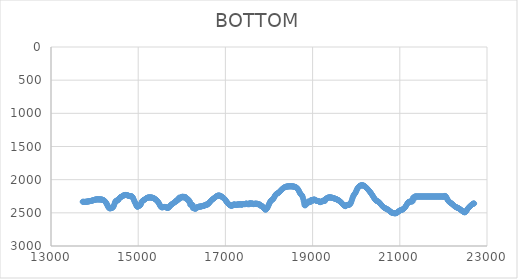
| Category | BOTTOM |
|---|---|
| 13726.741 | 2332.74 |
| 13736.9811 | 2333.78 |
| 13747.2211 | 2334.45 |
| 13757.4612 | 2334.8 |
| 13767.7013 | 2334.85 |
| 13777.9413 | 2334.63 |
| 13788.1814 | 2334.19 |
| 13798.4215 | 2333.54 |
| 13808.6615 | 2332.74 |
| 13818.9016 | 2331.8 |
| 13829.1416 | 2330.76 |
| 13839.3817 | 2329.65 |
| 13849.6218 | 2328.51 |
| 13859.8618 | 2327.37 |
| 13870.1019 | 2326.2 |
| 13880.342 | 2324.99 |
| 13890.582 | 2323.73 |
| 13900.8221 | 2322.39 |
| 13911.0622 | 2320.95 |
| 13921.3022 | 2319.39 |
| 13931.5423 | 2317.7 |
| 13941.7824 | 2315.85 |
| 13952.0224 | 2313.83 |
| 13962.2625 | 2311.7 |
| 13972.5026 | 2309.52 |
| 13982.7426 | 2307.33 |
| 13992.9827 | 2305.21 |
| 14003.2227 | 2303.2 |
| 14013.4628 | 2301.37 |
| 14023.7029 | 2299.78 |
| 14033.9429 | 2298.49 |
| 14044.183 | 2297.55 |
| 14054.4231 | 2297 |
| 14064.6631 | 2296.78 |
| 14074.9032 | 2296.81 |
| 14085.1433 | 2297 |
| 14095.3833 | 2297.27 |
| 14105.6234 | 2297.55 |
| 14115.8635 | 2297.76 |
| 14126.1035 | 2297.98 |
| 14136.3436 | 2298.3 |
| 14146.5837 | 2298.81 |
| 14156.8237 | 2299.6 |
| 14167.0638 | 2300.77 |
| 14177.3039 | 2302.39 |
| 14187.5439 | 2304.57 |
| 14197.784 | 2307.4 |
| 14208.024 | 2310.97 |
| 14218.2641 | 2315.4 |
| 14228.5042 | 2320.79 |
| 14238.7442 | 2327.28 |
| 14248.9843 | 2334.98 |
| 14259.2244 | 2344 |
| 14269.4644 | 2354.46 |
| 14279.7045 | 2366.52 |
| 14289.9446 | 2380.08 |
| 14300.1846 | 2394.14 |
| 14310.4247 | 2407.48 |
| 14320.6648 | 2418.86 |
| 14330.9048 | 2427.05 |
| 14341.1449 | 2431.23 |
| 14351.385 | 2432.26 |
| 14361.625 | 2431.38 |
| 14371.8651 | 2429.86 |
| 14382.1052 | 2428.61 |
| 14392.3452 | 2427.18 |
| 14402.5853 | 2424.75 |
| 14412.8253 | 2420.53 |
| 14423.0654 | 2413.7 |
| 14433.3055 | 2403.48 |
| 14443.5455 | 2389.04 |
| 14453.7856 | 2370.4 |
| 14464.0257 | 2350.76 |
| 14474.2657 | 2334.14 |
| 14484.5058 | 2323.58 |
| 14494.7459 | 2318.17 |
| 14504.9859 | 2316.01 |
| 14515.226 | 2315.23 |
| 14525.4661 | 2313.92 |
| 14535.7061 | 2310.21 |
| 14545.9462 | 2302.84 |
| 14556.1863 | 2293.03 |
| 14566.4263 | 2282.67 |
| 14576.6664 | 2273.62 |
| 14586.9064 | 2267.26 |
| 14597.1465 | 2263.02 |
| 14607.3866 | 2259.86 |
| 14617.6266 | 2256.73 |
| 14627.8667 | 2252.82 |
| 14638.1068 | 2248.42 |
| 14648.3468 | 2244.06 |
| 14658.5869 | 2240.19 |
| 14668.827 | 2236.92 |
| 14679.067 | 2234.28 |
| 14689.3071 | 2232.29 |
| 14699.5472 | 2230.98 |
| 14709.7872 | 2230.38 |
| 14720.0273 | 2230.5 |
| 14730.2674 | 2231.39 |
| 14740.5074 | 2233.02 |
| 14750.7475 | 2235.21 |
| 14760.9876 | 2237.76 |
| 14771.2276 | 2240.45 |
| 14781.4677 | 2243.06 |
| 14791.7077 | 2245.38 |
| 14801.9478 | 2247.19 |
| 14812.1879 | 2248.28 |
| 14822.4279 | 2248.61 |
| 14832.668 | 2248.84 |
| 14842.9081 | 2249.81 |
| 14853.1481 | 2252.35 |
| 14863.3882 | 2257.32 |
| 14873.6283 | 2265.53 |
| 14883.8683 | 2277.84 |
| 14894.1084 | 2294.27 |
| 14904.3485 | 2311.62 |
| 14914.5885 | 2326.79 |
| 14924.8286 | 2340.29 |
| 14935.0687 | 2353.53 |
| 14945.3087 | 2367.93 |
| 14955.5488 | 2383.97 |
| 14965.7889 | 2398.47 |
| 14976.0289 | 2407.34 |
| 14986.269 | 2407.89 |
| 14996.509 | 2403.13 |
| 15006.7491 | 2397.49 |
| 15016.9892 | 2394.29 |
| 15027.2292 | 2392.46 |
| 15037.4693 | 2389.84 |
| 15047.7094 | 2384.26 |
| 15057.9494 | 2373.56 |
| 15068.1895 | 2357.02 |
| 15078.4296 | 2339.77 |
| 15088.6696 | 2327.1 |
| 15098.9097 | 2318.92 |
| 15109.1498 | 2313.84 |
| 15119.3898 | 2310.46 |
| 15129.6299 | 2307.4 |
| 15139.87 | 2303.54 |
| 15150.11 | 2298.91 |
| 15160.3501 | 2293.84 |
| 15170.5902 | 2288.66 |
| 15180.8302 | 2283.69 |
| 15191.0703 | 2279.25 |
| 15201.3103 | 2275.6 |
| 15211.5504 | 2272.73 |
| 15221.7905 | 2270.56 |
| 15232.0305 | 2269.01 |
| 15242.2706 | 2268.02 |
| 15252.5107 | 2267.5 |
| 15262.7507 | 2267.37 |
| 15272.9908 | 2267.56 |
| 15283.2309 | 2267.99 |
| 15293.4709 | 2268.6 |
| 15303.711 | 2269.45 |
| 15313.9511 | 2270.59 |
| 15324.1911 | 2272.09 |
| 15334.4312 | 2274.02 |
| 15344.6713 | 2276.43 |
| 15354.9113 | 2279.39 |
| 15365.1514 | 2282.89 |
| 15375.3915 | 2286.92 |
| 15385.6315 | 2291.47 |
| 15395.8716 | 2296.51 |
| 15406.1116 | 2302.05 |
| 15416.3517 | 2308.07 |
| 15426.5918 | 2314.55 |
| 15436.8318 | 2321.48 |
| 15447.0719 | 2328.91 |
| 15457.312 | 2337.21 |
| 15467.552 | 2346.79 |
| 15477.7921 | 2358.07 |
| 15488.0322 | 2371.15 |
| 15498.2722 | 2384.77 |
| 15508.5123 | 2397.36 |
| 15518.7524 | 2407.34 |
| 15528.9924 | 2413.55 |
| 15539.2325 | 2416.47 |
| 15549.4726 | 2416.99 |
| 15559.7126 | 2415.99 |
| 15569.9527 | 2414.38 |
| 15580.1928 | 2412.91 |
| 15590.4328 | 2411.85 |
| 15600.6729 | 2411.33 |
| 15610.9129 | 2411.49 |
| 15621.153 | 2412.46 |
| 15631.3931 | 2414.38 |
| 15641.6331 | 2417.24 |
| 15651.8732 | 2420.47 |
| 15662.1133 | 2423.35 |
| 15672.3533 | 2425.18 |
| 15682.5934 | 2425.25 |
| 15692.8335 | 2422.82 |
| 15703.0735 | 2417.51 |
| 15713.3136 | 2410.08 |
| 15723.5537 | 2401.64 |
| 15733.7937 | 2393.26 |
| 15744.0338 | 2385.83 |
| 15754.2739 | 2379.36 |
| 15764.5139 | 2373.68 |
| 15774.754 | 2368.6 |
| 15784.9941 | 2363.93 |
| 15795.2341 | 2359.48 |
| 15805.4742 | 2355.26 |
| 15815.7142 | 2351.04 |
| 15825.9543 | 2342.59 |
| 15836.1944 | 2341.18 |
| 15846.4344 | 2336.96 |
| 15856.6745 | 2332.74 |
| 15866.9146 | 2317.25 |
| 15877.1546 | 2317.25 |
| 15887.3947 | 2320.07 |
| 15897.6348 | 2301.77 |
| 15907.8748 | 2298.95 |
| 15918.1149 | 2297.55 |
| 15928.355 | 2300.36 |
| 15938.595 | 2270.8 |
| 15948.8351 | 2275.02 |
| 15959.0752 | 2279.25 |
| 15969.3152 | 2280.65 |
| 15979.5553 | 2266.58 |
| 15989.7954 | 2262.36 |
| 16000.0354 | 2260.95 |
| 16010.2755 | 2259.54 |
| 16020.5156 | 2255.32 |
| 16030.7556 | 2269.39 |
| 16040.9957 | 2265.17 |
| 16051.2357 | 2262.36 |
| 16061.4758 | 2259.54 |
| 16071.7159 | 2262.36 |
| 16081.9559 | 2263.76 |
| 16092.196 | 2266.58 |
| 16102.4361 | 2289.1 |
| 16112.6761 | 2290.51 |
| 16122.9162 | 2293.32 |
| 16133.1563 | 2297.55 |
| 16143.3963 | 2301.77 |
| 16153.6364 | 2300.36 |
| 16163.8765 | 2332.74 |
| 16174.1165 | 2329.92 |
| 16184.3566 | 2328.51 |
| 16194.5967 | 2379.19 |
| 16204.8367 | 2374.97 |
| 16215.0768 | 2374.97 |
| 16225.3169 | 2376.37 |
| 16235.5569 | 2376.37 |
| 16245.797 | 2379.19 |
| 16256.037 | 2428.45 |
| 16266.2771 | 2428.45 |
| 16276.5172 | 2431.27 |
| 16286.7572 | 2431.27 |
| 16296.9973 | 2432.68 |
| 16307.2374 | 2436.9 |
| 16317.4774 | 2439.72 |
| 16327.7175 | 2422.82 |
| 16337.9576 | 2418.6 |
| 16348.1976 | 2420.01 |
| 16358.4377 | 2418.6 |
| 16368.6778 | 2414.38 |
| 16378.9178 | 2412.97 |
| 16389.1579 | 2408.75 |
| 16399.398 | 2404.53 |
| 16409.638 | 2408.75 |
| 16419.8781 | 2405.93 |
| 16430.1182 | 2405.93 |
| 16440.3582 | 2403.12 |
| 16450.5983 | 2400.3 |
| 16460.8384 | 2401.71 |
| 16471.0784 | 2397.49 |
| 16481.3185 | 2394.67 |
| 16491.5585 | 2397.49 |
| 16501.7986 | 2396.08 |
| 16512.0387 | 2393.26 |
| 16522.2787 | 2389.04 |
| 16532.5188 | 2380.6 |
| 16542.7589 | 2379.19 |
| 16552.9989 | 2374.97 |
| 16563.239 | 2379.19 |
| 16573.4791 | 2378.33 |
| 16583.7191 | 2375.63 |
| 16593.9592 | 2371.37 |
| 16604.1993 | 2365.8 |
| 16614.4393 | 2359.21 |
| 16624.6794 | 2351.85 |
| 16634.9195 | 2344 |
| 16645.1595 | 2335.92 |
| 16655.3996 | 2327.89 |
| 16665.6397 | 2320.17 |
| 16675.8797 | 2313.03 |
| 16686.1198 | 2306.66 |
| 16696.3598 | 2300.95 |
| 16706.5999 | 2295.69 |
| 16716.84 | 2290.68 |
| 16727.08 | 2285.74 |
| 16737.3201 | 2280.65 |
| 16747.5602 | 2275.3 |
| 16757.8002 | 2269.77 |
| 16768.0403 | 2264.25 |
| 16778.2804 | 2258.9 |
| 16788.5204 | 2253.9 |
| 16798.7605 | 2249.41 |
| 16809.0006 | 2245.6 |
| 16819.2406 | 2242.65 |
| 16829.4807 | 2240.68 |
| 16839.7208 | 2239.67 |
| 16849.9608 | 2239.57 |
| 16860.2009 | 2240.3 |
| 16870.441 | 2241.82 |
| 16880.681 | 2244.06 |
| 16890.9211 | 2246.95 |
| 16901.1612 | 2250.45 |
| 16911.4012 | 2254.49 |
| 16921.6413 | 2259.01 |
| 16931.8813 | 2263.94 |
| 16942.1214 | 2269.23 |
| 16952.3615 | 2274.82 |
| 16962.6015 | 2280.65 |
| 16972.8416 | 2286.66 |
| 16983.0817 | 2292.78 |
| 16993.3217 | 2298.95 |
| 17003.5618 | 2309.75 |
| 17013.8019 | 2319.94 |
| 17024.0419 | 2329.54 |
| 17034.282 | 2338.54 |
| 17044.5221 | 2346.94 |
| 17054.7621 | 2354.75 |
| 17065.0022 | 2361.96 |
| 17075.2423 | 2368.57 |
| 17085.4823 | 2374.58 |
| 17095.7224 | 2380 |
| 17105.9625 | 2384.82 |
| 17116.2025 | 2389.04 |
| 17126.4426 | 2391.71 |
| 17136.6827 | 2392.81 |
| 17146.9227 | 2392.36 |
| 17157.1628 | 2390.35 |
| 17167.4028 | 2386.78 |
| 17177.6429 | 2381.65 |
| 17187.883 | 2374.97 |
| 17198.123 | 2372.15 |
| 17208.3631 | 2374.97 |
| 17218.6032 | 2379.19 |
| 17228.8432 | 2376.37 |
| 17239.0833 | 2379.19 |
| 17249.3234 | 2382 |
| 17259.5634 | 2379.19 |
| 17269.8035 | 2374.97 |
| 17280.0436 | 2374.97 |
| 17290.2836 | 2370.74 |
| 17300.5237 | 2374.97 |
| 17310.7638 | 2377.78 |
| 17321.0038 | 2372.15 |
| 17331.2439 | 2370.74 |
| 17341.484 | 2366.52 |
| 17351.724 | 2370.74 |
| 17361.9641 | 2374.97 |
| 17372.2042 | 2379.19 |
| 17382.4442 | 2374.97 |
| 17392.6843 | 2370.74 |
| 17402.9243 | 2366.52 |
| 17413.1644 | 2369.33 |
| 17423.4045 | 2366.52 |
| 17433.6445 | 2366.52 |
| 17443.8846 | 2370.74 |
| 17454.1247 | 2367.93 |
| 17464.3647 | 2363.7 |
| 17474.6048 | 2359.48 |
| 17484.8449 | 2362.3 |
| 17495.0849 | 2362.3 |
| 17505.325 | 2366.52 |
| 17515.5651 | 2370.74 |
| 17525.8051 | 2366.52 |
| 17536.0452 | 2366.52 |
| 17546.2853 | 2370.74 |
| 17556.5253 | 2353.85 |
| 17566.7654 | 2358.07 |
| 17577.0055 | 2358.07 |
| 17587.2455 | 2362.3 |
| 17597.4856 | 2360.89 |
| 17607.7257 | 2358.07 |
| 17617.9657 | 2360.89 |
| 17628.2058 | 2360.89 |
| 17638.4458 | 2367.93 |
| 17648.6859 | 2369.33 |
| 17658.926 | 2365.11 |
| 17669.166 | 2365.11 |
| 17679.4061 | 2360.89 |
| 17689.6462 | 2363.7 |
| 17699.8862 | 2363.7 |
| 17710.1263 | 2359.48 |
| 17720.3664 | 2363.7 |
| 17730.6064 | 2369.33 |
| 17740.8465 | 2365.11 |
| 17751.0866 | 2369.33 |
| 17761.3266 | 2370.74 |
| 17771.5667 | 2374.97 |
| 17781.8068 | 2376.37 |
| 17792.0468 | 2373.56 |
| 17802.2869 | 2390.45 |
| 17812.527 | 2393.26 |
| 17822.767 | 2394.67 |
| 17833.0071 | 2395.56 |
| 17843.2472 | 2399.68 |
| 17853.4872 | 2406.23 |
| 17863.7273 | 2414.38 |
| 17873.9673 | 2423.31 |
| 17884.2074 | 2432.2 |
| 17894.4475 | 2440.23 |
| 17904.6875 | 2446.59 |
| 17914.9276 | 2450.44 |
| 17925.1677 | 2450.98 |
| 17935.4077 | 2447.61 |
| 17945.6478 | 2440.72 |
| 17955.8879 | 2430.92 |
| 17966.1279 | 2418.83 |
| 17976.368 | 2405.07 |
| 17986.6081 | 2390.24 |
| 17996.8481 | 2374.97 |
| 18007.0882 | 2359.88 |
| 18017.3283 | 2345.69 |
| 18027.5683 | 2333.11 |
| 18037.8084 | 2322.88 |
| 18048.0485 | 2315.43 |
| 18058.2885 | 2309.99 |
| 18068.5286 | 2305.55 |
| 18078.7687 | 2301.04 |
| 18089.0087 | 2295.44 |
| 18099.2488 | 2287.69 |
| 18109.4888 | 2277.15 |
| 18119.7289 | 2264.7 |
| 18129.969 | 2251.6 |
| 18140.209 | 2239.14 |
| 18150.4491 | 2228.57 |
| 18160.6892 | 2220.83 |
| 18170.9292 | 2215.41 |
| 18181.1693 | 2211.47 |
| 18191.4094 | 2208.16 |
| 18201.6494 | 2204.64 |
| 18211.8895 | 2200.23 |
| 18222.1296 | 2194.92 |
| 18232.3696 | 2188.89 |
| 18242.6097 | 2182.31 |
| 18252.8498 | 2175.33 |
| 18263.0898 | 2168.14 |
| 18273.3299 | 2160.9 |
| 18283.57 | 2153.77 |
| 18293.81 | 2146.93 |
| 18304.0501 | 2140.52 |
| 18314.2902 | 2134.58 |
| 18324.5302 | 2129.14 |
| 18334.7703 | 2124.21 |
| 18345.0104 | 2119.81 |
| 18355.2504 | 2115.96 |
| 18365.4905 | 2112.68 |
| 18375.7305 | 2109.91 |
| 18385.9706 | 2107.62 |
| 18396.2107 | 2105.74 |
| 18406.4507 | 2104.24 |
| 18416.6908 | 2103.05 |
| 18426.9309 | 2102.13 |
| 18437.1709 | 2101.43 |
| 18447.411 | 2100.9 |
| 18457.6511 | 2100.48 |
| 18467.8911 | 2100.14 |
| 18478.1312 | 2099.89 |
| 18488.3713 | 2099.74 |
| 18498.6113 | 2099.71 |
| 18508.8514 | 2099.82 |
| 18519.0915 | 2100.09 |
| 18529.3315 | 2100.54 |
| 18539.5716 | 2101.18 |
| 18549.8117 | 2102.05 |
| 18560.0517 | 2103.14 |
| 18570.2918 | 2104.49 |
| 18580.5319 | 2106.11 |
| 18590.7719 | 2108.04 |
| 18601.012 | 2110.43 |
| 18611.2521 | 2113.43 |
| 18621.4921 | 2117.21 |
| 18631.7322 | 2121.92 |
| 18641.9722 | 2127.74 |
| 18652.2123 | 2134.81 |
| 18662.4524 | 2143.31 |
| 18672.6924 | 2153.4 |
| 18682.9325 | 2165.23 |
| 18693.1726 | 2178.7 |
| 18703.4126 | 2192.62 |
| 18713.6527 | 2205.51 |
| 18723.8928 | 2215.9 |
| 18734.1328 | 2223.03 |
| 18744.3729 | 2228.86 |
| 18754.613 | 2236.06 |
| 18764.853 | 2247.27 |
| 18775.0931 | 2265.17 |
| 18785.3332 | 2291.29 |
| 18795.5732 | 2322.68 |
| 18805.8133 | 2355.26 |
| 18816.0534 | 2386.23 |
| 18826.2934 | 2382 |
| 18836.5335 | 2386.23 |
| 18846.7736 | 2358.07 |
| 18857.0136 | 2358.07 |
| 18867.2537 | 2359.48 |
| 18877.4937 | 2358.07 |
| 18887.7338 | 2353.85 |
| 18897.9739 | 2329.92 |
| 18908.2139 | 2331.33 |
| 18918.454 | 2332.74 |
| 18928.6941 | 2336.96 |
| 18938.9341 | 2338.37 |
| 18949.1742 | 2335.55 |
| 18959.4143 | 2311.62 |
| 18969.6543 | 2308.81 |
| 18979.8944 | 2305.99 |
| 18990.1345 | 2308.81 |
| 19000.3745 | 2313.03 |
| 19010.6146 | 2317.25 |
| 19020.8547 | 2300.36 |
| 19031.0947 | 2300.36 |
| 19041.3348 | 2300.36 |
| 19051.5749 | 2303.18 |
| 19061.8149 | 2307.4 |
| 19072.055 | 2311.62 |
| 19082.2951 | 2317.25 |
| 19092.5351 | 2318.66 |
| 19102.7752 | 2320.07 |
| 19113.0153 | 2320.07 |
| 19123.2553 | 2320.07 |
| 19133.4954 | 2322.88 |
| 19143.7354 | 2327.11 |
| 19153.9755 | 2332.74 |
| 19164.2156 | 2335.55 |
| 19174.4556 | 2339.77 |
| 19184.6957 | 2335.55 |
| 19194.9358 | 2331.33 |
| 19205.1758 | 2328.51 |
| 19215.4159 | 2327.11 |
| 19225.656 | 2327.11 |
| 19235.896 | 2317.25 |
| 19246.1361 | 2317.25 |
| 19256.3762 | 2321.48 |
| 19266.6162 | 2317.25 |
| 19276.8563 | 2315.85 |
| 19287.0964 | 2318.66 |
| 19297.3364 | 2291.92 |
| 19307.5765 | 2287.69 |
| 19317.8166 | 2283.47 |
| 19328.0566 | 2279.25 |
| 19338.2967 | 2275.02 |
| 19348.5368 | 2273.62 |
| 19358.7768 | 2269.39 |
| 19369.0169 | 2269.39 |
| 19379.257 | 2267.99 |
| 19389.497 | 2267.99 |
| 19399.7371 | 2263.76 |
| 19409.9772 | 2266.58 |
| 19420.2172 | 2272.21 |
| 19430.4573 | 2270.8 |
| 19440.6973 | 2270.8 |
| 19450.9374 | 2273.03 |
| 19461.1775 | 2275.2 |
| 19471.4175 | 2277.36 |
| 19481.6576 | 2279.51 |
| 19491.8977 | 2281.7 |
| 19502.1377 | 2283.95 |
| 19512.3778 | 2286.29 |
| 19522.6179 | 2288.74 |
| 19532.8579 | 2291.33 |
| 19543.098 | 2294.1 |
| 19553.3381 | 2297.06 |
| 19563.5781 | 2300.25 |
| 19573.8182 | 2303.7 |
| 19584.0583 | 2307.43 |
| 19594.2983 | 2311.47 |
| 19604.5384 | 2315.85 |
| 19614.7785 | 2320.59 |
| 19625.0185 | 2325.74 |
| 19635.2586 | 2331.33 |
| 19645.4987 | 2337.41 |
| 19655.7387 | 2344 |
| 19665.9788 | 2351.1 |
| 19676.2189 | 2358.51 |
| 19686.4589 | 2365.98 |
| 19696.699 | 2373.25 |
| 19706.939 | 2380.08 |
| 19717.1791 | 2386.23 |
| 19727.4192 | 2390.45 |
| 19737.6592 | 2393.26 |
| 19747.8993 | 2398.89 |
| 19758.1394 | 2398.89 |
| 19768.3794 | 2390.49 |
| 19778.6195 | 2385.1 |
| 19788.8596 | 2382.03 |
| 19799.0996 | 2380.6 |
| 19809.3397 | 2380.09 |
| 19819.5798 | 2379.81 |
| 19829.8198 | 2379.07 |
| 19840.0599 | 2377.16 |
| 19850.3 | 2373.4 |
| 19860.54 | 2367.09 |
| 19870.7801 | 2357.52 |
| 19881.0202 | 2344 |
| 19891.2602 | 2326.28 |
| 19901.5003 | 2305.91 |
| 19911.7404 | 2284.88 |
| 19921.9804 | 2265.11 |
| 19932.2205 | 2248.28 |
| 19942.4606 | 2235.46 |
| 19952.7006 | 2225.58 |
| 19962.9407 | 2217.04 |
| 19973.1807 | 2208.25 |
| 19983.4208 | 2197.61 |
| 19993.6609 | 2184.04 |
| 20003.9009 | 2168.6 |
| 20014.141 | 2152.89 |
| 20024.3811 | 2138.49 |
| 20034.6211 | 2126.63 |
| 20044.8612 | 2117.15 |
| 20055.1013 | 2109.54 |
| 20065.3413 | 2103.3 |
| 20075.5814 | 2097.98 |
| 20085.8215 | 2093.52 |
| 20096.0615 | 2089.92 |
| 20106.3016 | 2087.19 |
| 20116.5417 | 2085.32 |
| 20126.7817 | 2084.33 |
| 20137.0218 | 2084.22 |
| 20147.2619 | 2084.99 |
| 20157.5019 | 2086.66 |
| 20167.742 | 2089.22 |
| 20177.9821 | 2092.66 |
| 20188.2221 | 2096.9 |
| 20198.4622 | 2101.8 |
| 20208.7023 | 2107.25 |
| 20218.9423 | 2113.15 |
| 20229.1824 | 2119.38 |
| 20239.4225 | 2125.93 |
| 20249.6625 | 2132.76 |
| 20259.9026 | 2139.88 |
| 20270.1426 | 2147.26 |
| 20280.3827 | 2154.9 |
| 20290.6228 | 2162.77 |
| 20300.8628 | 2170.86 |
| 20311.1029 | 2179.18 |
| 20321.343 | 2187.77 |
| 20331.583 | 2196.71 |
| 20341.8231 | 2206.07 |
| 20352.0632 | 2215.9 |
| 20362.3032 | 2225.75 |
| 20372.5433 | 2236.29 |
| 20382.7834 | 2247.26 |
| 20393.0234 | 2258.39 |
| 20403.2635 | 2269.39 |
| 20413.5036 | 2280 |
| 20423.7436 | 2289.95 |
| 20433.9837 | 2298.95 |
| 20444.2238 | 2306.73 |
| 20454.4638 | 2313.03 |
| 20464.7039 | 2317.71 |
| 20474.944 | 2321.26 |
| 20485.184 | 2324.29 |
| 20495.4241 | 2327.44 |
| 20505.6642 | 2331.33 |
| 20515.9042 | 2336.44 |
| 20526.1443 | 2342.64 |
| 20536.3844 | 2349.67 |
| 20546.6244 | 2357.25 |
| 20556.8645 | 2365.11 |
| 20567.1046 | 2373.01 |
| 20577.3446 | 2380.81 |
| 20587.5847 | 2388.39 |
| 20597.8247 | 2395.65 |
| 20608.0648 | 2402.47 |
| 20618.3049 | 2408.75 |
| 20628.5449 | 2414.4 |
| 20638.785 | 2419.47 |
| 20649.0251 | 2424.05 |
| 20659.2651 | 2428.22 |
| 20669.5052 | 2432.08 |
| 20679.7453 | 2435.69 |
| 20689.9853 | 2439.14 |
| 20700.2254 | 2442.53 |
| 20710.4655 | 2445.94 |
| 20720.7055 | 2449.49 |
| 20730.9456 | 2453.33 |
| 20741.1857 | 2457.58 |
| 20751.4257 | 2462.38 |
| 20761.6658 | 2467.87 |
| 20771.9059 | 2474.05 |
| 20782.1459 | 2480.49 |
| 20792.386 | 2486.59 |
| 20802.6261 | 2491.8 |
| 20812.8661 | 2495.68 |
| 20823.1062 | 2498.42 |
| 20833.3463 | 2500.35 |
| 20843.5863 | 2501.79 |
| 20853.8264 | 2503.06 |
| 20864.0665 | 2504.4 |
| 20874.3065 | 2505.64 |
| 20884.5466 | 2506.53 |
| 20894.7866 | 2506.8 |
| 20905.0267 | 2506.2 |
| 20915.2668 | 2504.47 |
| 20925.5068 | 2501.43 |
| 20935.7469 | 2497.3 |
| 20945.987 | 2492.38 |
| 20956.227 | 2486.97 |
| 20966.4671 | 2481.37 |
| 20976.7072 | 2475.88 |
| 20986.9472 | 2470.81 |
| 20997.1873 | 2466.46 |
| 21007.4274 | 2463.03 |
| 21017.6674 | 2460.32 |
| 21027.9075 | 2458.05 |
| 21038.1476 | 2455.93 |
| 21048.3876 | 2453.67 |
| 21058.6277 | 2450.98 |
| 21068.8678 | 2447.6 |
| 21079.1078 | 2443.41 |
| 21089.3479 | 2438.33 |
| 21099.588 | 2432.27 |
| 21109.828 | 2425.14 |
| 21120.0681 | 2416.86 |
| 21130.3082 | 2407.34 |
| 21140.5482 | 2396.6 |
| 21150.7883 | 2385.13 |
| 21161.0284 | 2373.5 |
| 21171.2684 | 2362.3 |
| 21181.5085 | 2352.11 |
| 21191.7486 | 2343.53 |
| 21201.9886 | 2337.14 |
| 21212.2287 | 2333.52 |
| 21222.4687 | 2333.27 |
| 21232.7088 | 2336.96 |
| 21242.9489 | 2327.11 |
| 21253.1889 | 2325.7 |
| 21263.429 | 2331.33 |
| 21273.6691 | 2327.11 |
| 21283.9091 | 2322.88 |
| 21294.1492 | 2325.7 |
| 21304.3893 | 2275.02 |
| 21314.6293 | 2266.58 |
| 21324.8694 | 2266.58 |
| 21335.1095 | 2284.88 |
| 21345.3495 | 2253.91 |
| 21355.5896 | 2253.91 |
| 21365.8297 | 2253.91 |
| 21376.0697 | 2253.91 |
| 21386.3098 | 2253.91 |
| 21396.5499 | 2253.91 |
| 21406.7899 | 2253.91 |
| 21417.03 | 2253.91 |
| 21427.2701 | 2253.91 |
| 21437.5101 | 2253.91 |
| 21447.7502 | 2253.91 |
| 21457.9903 | 2253.91 |
| 21468.2303 | 2253.91 |
| 21478.4704 | 2253.91 |
| 21488.7105 | 2253.91 |
| 21498.9505 | 2253.91 |
| 21509.1906 | 2253.91 |
| 21519.4307 | 2253.91 |
| 21529.6707 | 2253.91 |
| 21539.9108 | 2253.91 |
| 21550.1508 | 2253.91 |
| 21560.3909 | 2253.91 |
| 21570.631 | 2253.91 |
| 21580.871 | 2253.91 |
| 21591.1111 | 2253.91 |
| 21601.3512 | 2253.91 |
| 21611.5912 | 2253.91 |
| 21621.8313 | 2253.91 |
| 21632.0714 | 2253.91 |
| 21642.3114 | 2253.91 |
| 21652.5515 | 2253.91 |
| 21662.7916 | 2253.91 |
| 21673.0316 | 2253.91 |
| 21683.2717 | 2253.91 |
| 21693.5118 | 2253.91 |
| 21703.7518 | 2253.91 |
| 21713.9919 | 2253.91 |
| 21724.232 | 2253.91 |
| 21734.472 | 2253.91 |
| 21744.7121 | 2253.91 |
| 21754.9522 | 2253.91 |
| 21765.1922 | 2253.91 |
| 21775.4323 | 2253.91 |
| 21785.6724 | 2253.91 |
| 21795.9124 | 2253.91 |
| 21806.1525 | 2253.91 |
| 21816.3926 | 2253.91 |
| 21826.6326 | 2253.91 |
| 21836.8727 | 2253.91 |
| 21847.1128 | 2253.91 |
| 21857.3528 | 2253.91 |
| 21867.5929 | 2253.91 |
| 21877.8329 | 2253.91 |
| 21888.073 | 2253.91 |
| 21898.3131 | 2253.91 |
| 21908.5531 | 2253.91 |
| 21918.7932 | 2253.91 |
| 21929.0333 | 2253.91 |
| 21939.2733 | 2253.91 |
| 21949.5134 | 2253.91 |
| 21959.7535 | 2253.91 |
| 21969.9935 | 2253.91 |
| 21980.2336 | 2253.91 |
| 21990.4737 | 2253.91 |
| 22000.7137 | 2253.91 |
| 22010.9538 | 2259.54 |
| 22021.1939 | 2251.09 |
| 22031.4339 | 2245.28 |
| 22041.674 | 2245.73 |
| 22051.9141 | 2251.2 |
| 22062.1541 | 2260.44 |
| 22072.3942 | 2272.21 |
| 22082.6343 | 2285.26 |
| 22092.8743 | 2298.34 |
| 22103.1144 | 2310.21 |
| 22113.3545 | 2319.92 |
| 22123.5945 | 2327.66 |
| 22133.8346 | 2333.92 |
| 22144.0747 | 2339.21 |
| 22154.3147 | 2344 |
| 22164.5548 | 2348.72 |
| 22174.7949 | 2353.54 |
| 22185.0349 | 2358.52 |
| 22195.275 | 2363.76 |
| 22205.5151 | 2369.33 |
| 22215.7551 | 2375.29 |
| 22225.9952 | 2381.47 |
| 22236.2352 | 2387.68 |
| 22246.4753 | 2393.73 |
| 22256.7154 | 2399.41 |
| 22266.9554 | 2404.53 |
| 22277.1955 | 2408.94 |
| 22287.4356 | 2412.76 |
| 22297.6756 | 2416.12 |
| 22307.9157 | 2419.19 |
| 22318.1558 | 2422.11 |
| 22328.3958 | 2425.05 |
| 22338.6359 | 2428.16 |
| 22348.876 | 2431.59 |
| 22359.116 | 2435.49 |
| 22369.3561 | 2439.97 |
| 22379.5962 | 2444.92 |
| 22389.8362 | 2450.15 |
| 22400.0763 | 2455.51 |
| 22410.3164 | 2460.83 |
| 22420.5564 | 2465.96 |
| 22430.7965 | 2470.9 |
| 22441.0366 | 2475.67 |
| 22451.2766 | 2480.28 |
| 22461.5167 | 2484.76 |
| 22471.7568 | 2488.91 |
| 22481.9968 | 2491.68 |
| 22492.2369 | 2491.8 |
| 22502.477 | 2488.34 |
| 22512.717 | 2481.83 |
| 22522.9571 | 2473.12 |
| 22533.1972 | 2463.1 |
| 22543.4372 | 2452.61 |
| 22553.6773 | 2442.53 |
| 22563.9174 | 2433.54 |
| 22574.1574 | 2425.58 |
| 22584.3975 | 2418.38 |
| 22594.6375 | 2411.71 |
| 22604.8776 | 2405.3 |
| 22615.1177 | 2398.89 |
| 22625.3577 | 2392.33 |
| 22635.5978 | 2385.76 |
| 22645.8379 | 2379.43 |
| 22656.0779 | 2373.56 |
| 22666.318 | 2368.39 |
| 22676.5581 | 2364.16 |
| 22686.7981 | 2361.11 |
| 22697.0382 | 2359.47 |
| 22704.7944 | 2359.48 |